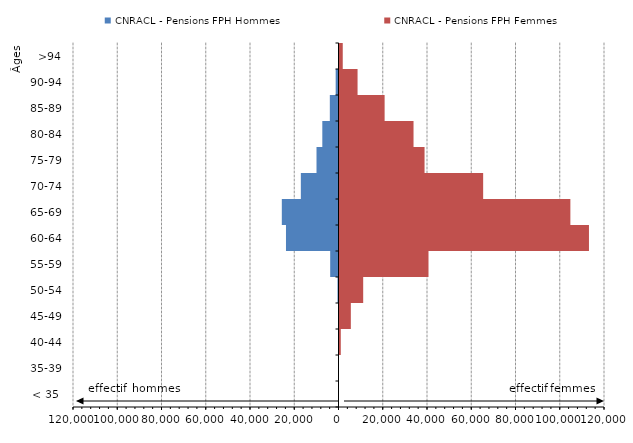
| Category | CNRACL - Pensions FPH Hommes | CNRACL - Pensions FPH Femmes |
|---|---|---|
| < 35  | -2 | 20 |
| 35-39 | -24 | 125 |
| 40-44 | -79 | 1032 |
| 45-49 | -210 | 5577 |
| 50-54 | -460 | 11160 |
| 55-59 | -3758 | 40680 |
| 60-64 | -23736 | 113206 |
| 65-69 | -25618 | 104801 |
| 70-74 | -17018 | 65380 |
| 75-79 | -9941 | 38893 |
| 80-84 | -7319 | 33911 |
| 85-89 | -3922 | 20844 |
| 90-94 | -1276 | 8615 |
| >94 | -216 | 1922 |